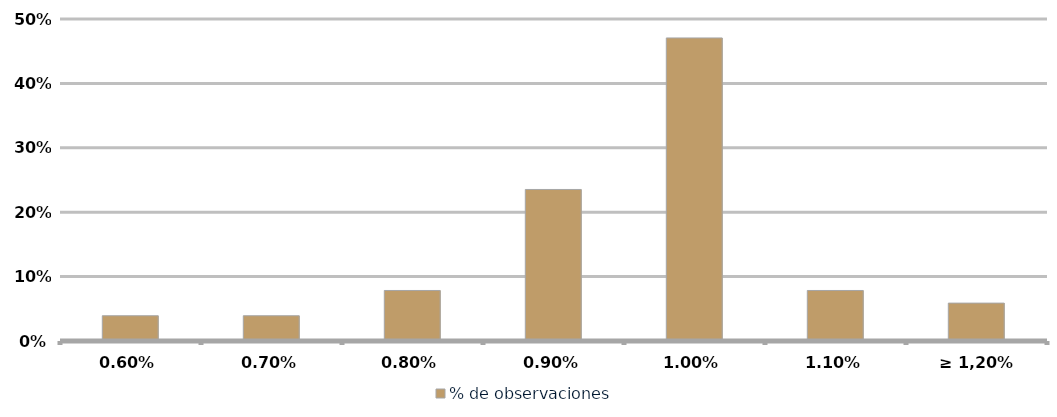
| Category | % de observaciones  |
|---|---|
| 0,60% | 0.039 |
| 0,70% | 0.039 |
| 0,80% | 0.078 |
| 0,90% | 0.235 |
| 1,00% | 0.471 |
| 1,10% | 0.078 |
| ≥ 1,20% | 0.059 |